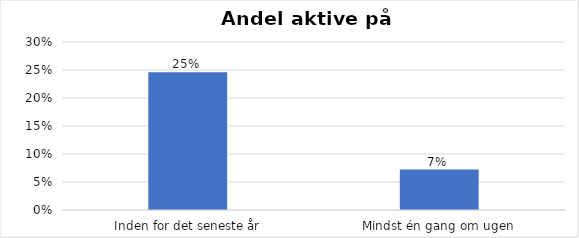
| Category | % |
|---|---|
| Inden for det seneste år | 0.246 |
| Mindst én gang om ugen | 0.072 |